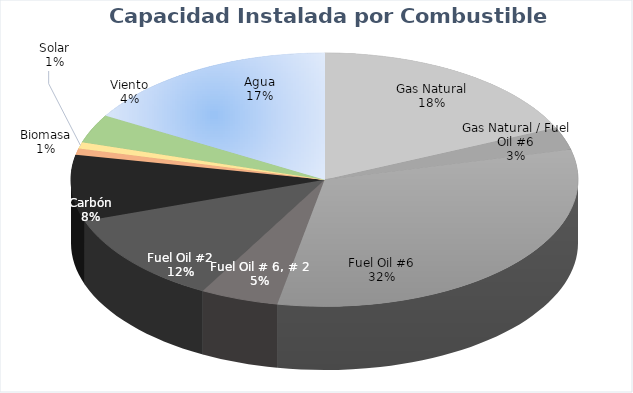
| Category | Potencia  (MW) | % |
|---|---|---|
| Gas Natural | 678.3 | 0.183 |
| Gas Natural / Fuel Oil #6 | 108 | 0.029 |
| Fuel Oil #6 | 1180.89 | 0.318 |
| Fuel Oil # 6, # 2 | 185 | 0.05 |
| Fuel Oil #2 | 435.9 | 0.117 |
| Carbón | 313.6 | 0.084 |
| Biomasa | 30 | 0.008 |
| Solar | 30 | 0.008 |
| Viento | 135.7 | 0.037 |
| Agua | 615.72 | 0.166 |